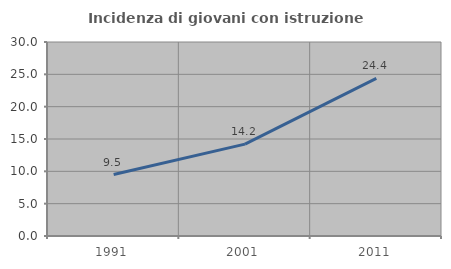
| Category | Incidenza di giovani con istruzione universitaria |
|---|---|
| 1991.0 | 9.509 |
| 2001.0 | 14.211 |
| 2011.0 | 24.375 |